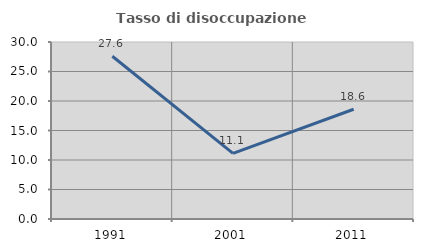
| Category | Tasso di disoccupazione giovanile  |
|---|---|
| 1991.0 | 27.586 |
| 2001.0 | 11.111 |
| 2011.0 | 18.605 |